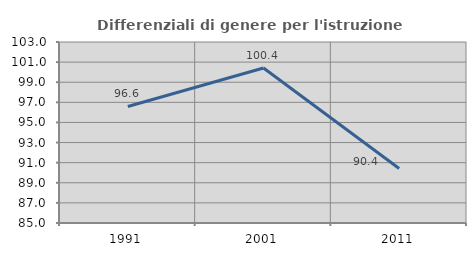
| Category | Differenziali di genere per l'istruzione superiore |
|---|---|
| 1991.0 | 96.59 |
| 2001.0 | 100.416 |
| 2011.0 | 90.419 |